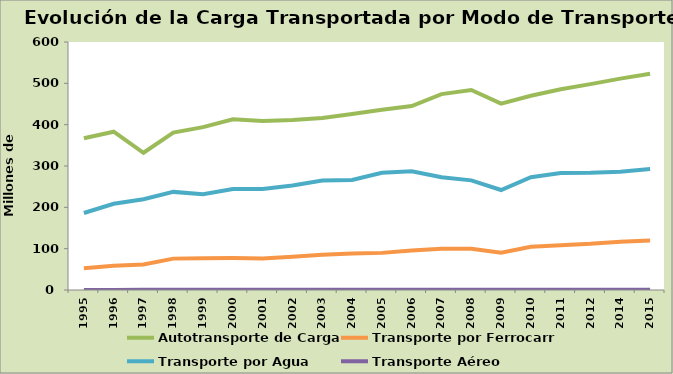
| Category | Autotransporte de Carga | Transporte por Ferrocarril | Transporte por Agua | Transporte Aéreo |
|---|---|---|---|---|
| 1995.0 | 367 | 52.48 | 186.26 | 0.252 |
| 1996.0 | 383 | 58.831 | 208.581 | 0.285 |
| 1997.0 | 332 | 61.666 | 219.653 | 0.335 |
| 1998.0 | 381 | 75.914 | 237.38 | 0.388 |
| 1999.0 | 394 | 77.062 | 231.44 | 0.407 |
| 2000.0 | 413 | 77.164 | 244.252 | 0.379 |
| 2001.0 | 409 | 76.182 | 244.431 | 0.351 |
| 2002.0 | 411 | 80.451 | 253.046 | 0.389 |
| 2003.0 | 416 | 85.168 | 264.739 | 0.41 |
| 2004.0 | 426 | 88.097 | 266.008 | 0.467 |
| 2005.0 | 436 | 89.814 | 283.604 | 0.529 |
| 2006.0 | 445 | 95.713 | 287.432 | 0.544 |
| 2007.0 | 474 | 99.845 | 272.934 | 0.572 |
| 2008.0 | 484 | 99.692 | 265.237 | 0.525 |
| 2009.0 | 451 | 90.321 | 241.923 | 0.466 |
| 2010.0 | 470 | 104.564 | 272.811 | 0.571 |
| 2011.0 | 485.502 | 108.433 | 282.902 | 0.562 |
| 2012.0 | 498.147 | 111.607 | 283.462 | 0.559 |
| 2014.0 | 511.34 | 116.936 | 286.134 | 0.618 |
| 2015.0 | 522.99 | 119.707 | 292.469 | 0.629 |